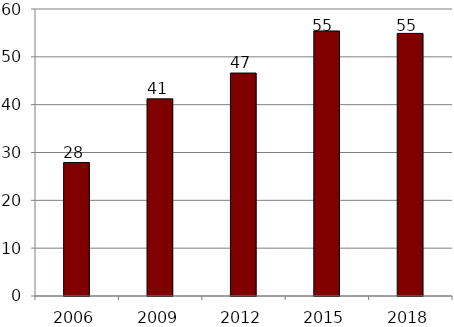
| Category | Series 1 |
|---|---|
| 2006.0 | 27.894 |
| 2009.0 | 41.211 |
| 2012.0 | 46.608 |
| 2015.0 | 55.409 |
| 2018.0 | 54.898 |